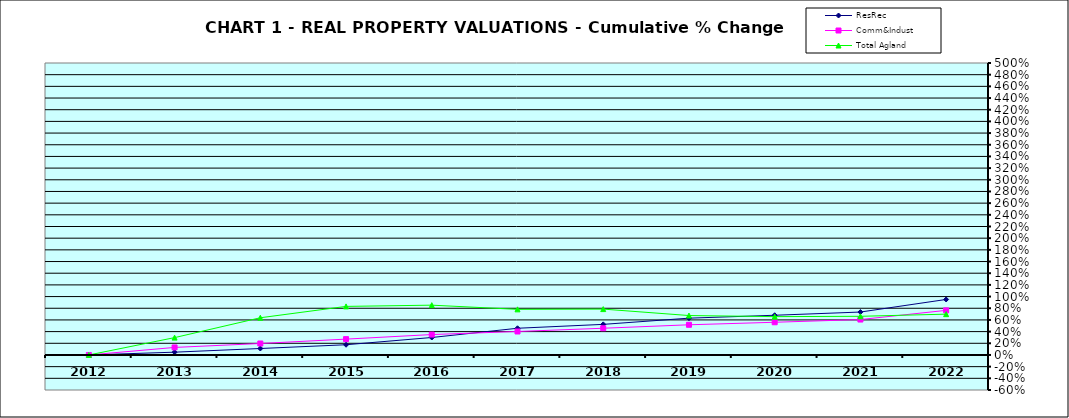
| Category | ResRec | Comm&Indust | Total Agland |
|---|---|---|---|
| 2012.0 | 0 | 0 | 0 |
| 2013.0 | 0.048 | 0.129 | 0.297 |
| 2014.0 | 0.111 | 0.196 | 0.637 |
| 2015.0 | 0.175 | 0.271 | 0.832 |
| 2016.0 | 0.299 | 0.35 | 0.853 |
| 2017.0 | 0.457 | 0.402 | 0.781 |
| 2018.0 | 0.524 | 0.458 | 0.786 |
| 2019.0 | 0.63 | 0.517 | 0.675 |
| 2020.0 | 0.68 | 0.56 | 0.656 |
| 2021.0 | 0.735 | 0.607 | 0.662 |
| 2022.0 | 0.951 | 0.764 | 0.699 |